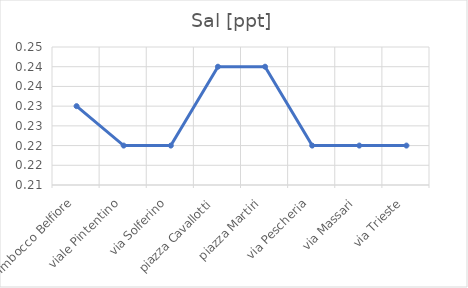
| Category | Sal [ppt] |
|---|---|
| Imbocco Belfiore | 0.23 |
| viale Pintentino | 0.22 |
| via Solferino | 0.22 |
| piazza Cavallotti | 0.24 |
| piazza Martiri | 0.24 |
| via Pescheria | 0.22 |
| via Massari | 0.22 |
| via Trieste | 0.22 |